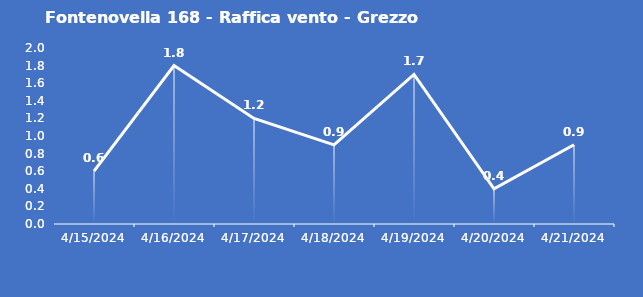
| Category | Fontenovella 168 - Raffica vento - Grezzo (m/s) |
|---|---|
| 4/15/24 | 0.6 |
| 4/16/24 | 1.8 |
| 4/17/24 | 1.2 |
| 4/18/24 | 0.9 |
| 4/19/24 | 1.7 |
| 4/20/24 | 0.4 |
| 4/21/24 | 0.9 |